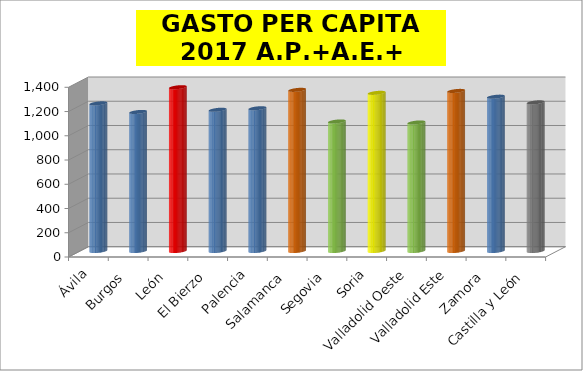
| Category | Series 0 |
|---|---|
| Ávila | 1217.902 |
| Burgos | 1147.167 |
| León | 1351.122 |
| El Bierzo | 1165.062 |
| Palencia | 1177.614 |
| Salamanca | 1329.431 |
| Segovia | 1068.685 |
| Soria | 1304.73 |
| Valladolid Oeste | 1060.308 |
| Valladolid Este | 1320.523 |
| Zamora | 1273.045 |
| Castilla y León | 1226.342 |